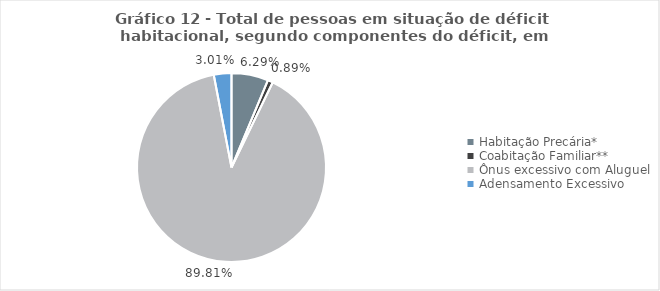
| Category | Series 0 | Series 1 |
|---|---|---|
| Habitação Precária* | 0.063 | 0.063 |
| Coabitação Familiar** | 0.009 | 0.009 |
| Ônus excessivo com Aluguel | 0.898 | 0.898 |
| Adensamento Excessivo | 0.03 | 0.03 |